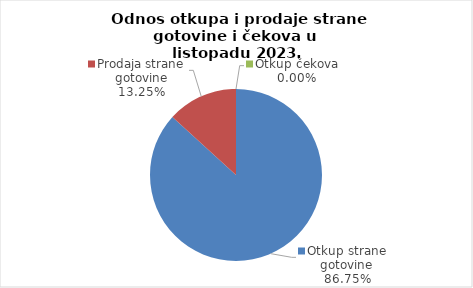
| Category | Series 0 |
|---|---|
| Otkup strane gotovine | 86.751 |
| Prodaja strane gotovine | 13.249 |
| Otkup čekova | 0 |